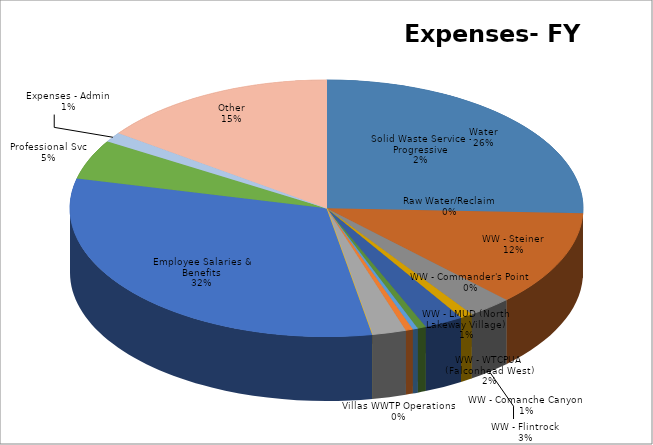
| Category | Series 0 | Series 1 |
|---|---|---|
| Water | 4535724 | 0.256 |
| WW - Steiner | 2125750 | 0.12 |
| WW - Flintrock | 495200 | 0.028 |
| WW - Comanche Canyon | 137600 | 0.008 |
| WW - WTCPUA (Falconhead West) | 438100 | 0.025 |
| WW - LMUD (North Lakeway Village) | 93500 | 0.005 |
| WW - Commander's Point | 58500 | 0.003 |
| Raw Water/Reclaim | 80500 | 0.005 |
| Solid Waste Service - Progressive | 380000 | 0.021 |
| Villas WWTP Operations | 0 | 0 |
| Employee Salaries & Benefits | 5587583 | 0.316 |
| Professional Svc | 885000 | 0.05 |
| Expenses - Admin | 217375 | 0.012 |
| Other | 2663200 | 0.15 |